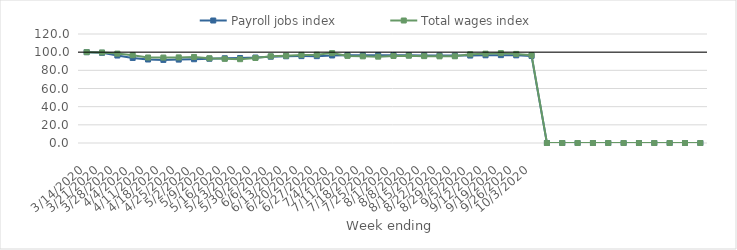
| Category | Payroll jobs index | Total wages index |
|---|---|---|
| 14/03/2020 | 100 | 100 |
| 21/03/2020 | 99.271 | 99.673 |
| 28/03/2020 | 96.296 | 98.402 |
| 04/04/2020 | 93.638 | 96.698 |
| 11/04/2020 | 91.923 | 94.162 |
| 18/04/2020 | 91.471 | 94.06 |
| 25/04/2020 | 91.807 | 94.247 |
| 02/05/2020 | 92.206 | 94.699 |
| 09/05/2020 | 92.756 | 93.319 |
| 16/05/2020 | 93.289 | 92.663 |
| 23/05/2020 | 93.593 | 92.285 |
| 30/05/2020 | 94.094 | 93.58 |
| 06/06/2020 | 95.016 | 95.453 |
| 13/06/2020 | 95.471 | 96.086 |
| 20/06/2020 | 95.658 | 97.003 |
| 27/06/2020 | 95.603 | 97.208 |
| 04/07/2020 | 96.357 | 98.944 |
| 11/07/2020 | 96.686 | 95.884 |
| 18/07/2020 | 96.562 | 95.403 |
| 25/07/2020 | 96.622 | 95.053 |
| 01/08/2020 | 96.719 | 95.78 |
| 08/08/2020 | 96.574 | 96.121 |
| 15/08/2020 | 96.402 | 95.627 |
| 22/08/2020 | 96.279 | 95.418 |
| 29/08/2020 | 96.2 | 95.474 |
| 05/09/2020 | 96.273 | 97.682 |
| 12/09/2020 | 96.568 | 98.358 |
| 19/09/2020 | 96.733 | 98.934 |
| 26/09/2020 | 96.519 | 98.073 |
| 03/10/2020 | 95.865 | 96.714 |